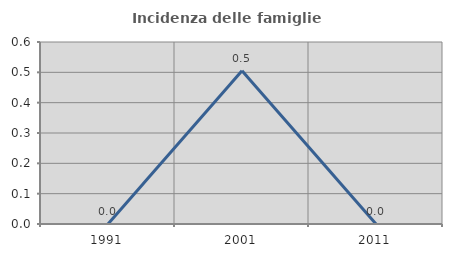
| Category | Incidenza delle famiglie numerose |
|---|---|
| 1991.0 | 0 |
| 2001.0 | 0.505 |
| 2011.0 | 0 |